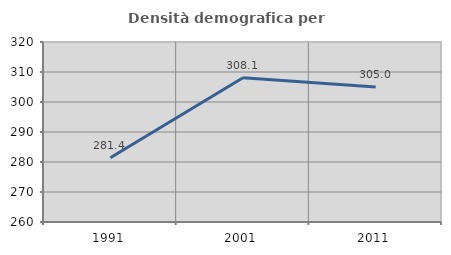
| Category | Densità demografica |
|---|---|
| 1991.0 | 281.403 |
| 2001.0 | 308.058 |
| 2011.0 | 304.994 |